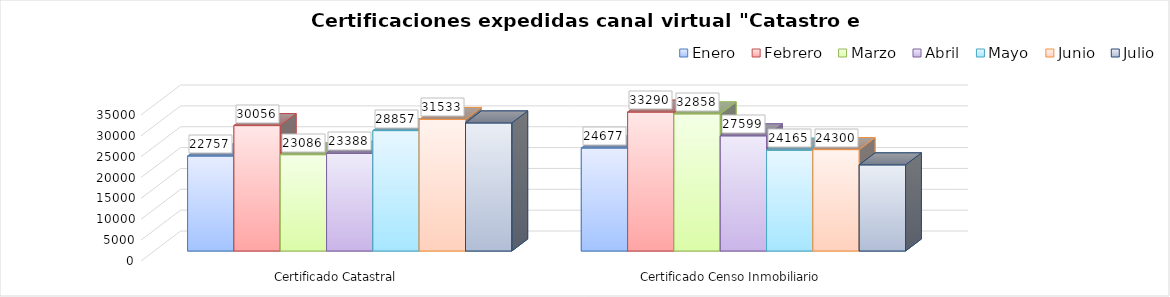
| Category | Enero | Febrero | Marzo | Abril | Mayo | Junio | Julio |
|---|---|---|---|---|---|---|---|
| Certificado Catastral | 22757 | 30056 | 23086 | 23388 | 28857 | 31533 | 30695 |
| Certificado Censo Inmobiliario | 24677 | 33290 | 32858 | 27599 | 24165 | 24300 | 20642 |